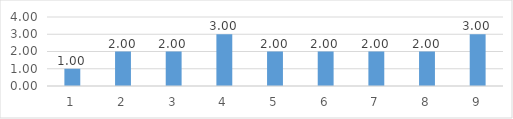
| Category | Series 0 |
|---|---|
| 0 | 1 |
| 1 | 2 |
| 2 | 2 |
| 3 | 3 |
| 4 | 2 |
| 5 | 2 |
| 6 | 2 |
| 7 | 2 |
| 8 | 3 |